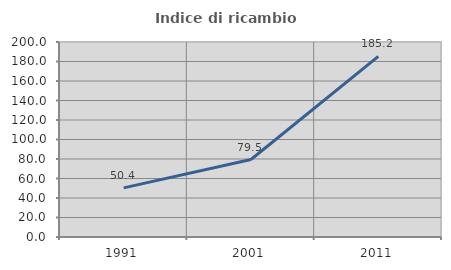
| Category | Indice di ricambio occupazionale  |
|---|---|
| 1991.0 | 50.385 |
| 2001.0 | 79.458 |
| 2011.0 | 185.246 |